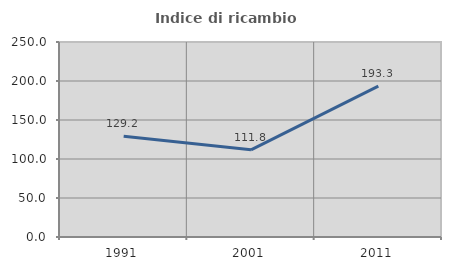
| Category | Indice di ricambio occupazionale  |
|---|---|
| 1991.0 | 129.167 |
| 2001.0 | 111.765 |
| 2011.0 | 193.333 |